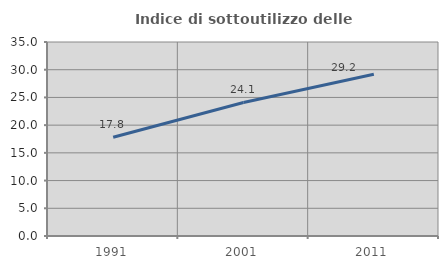
| Category | Indice di sottoutilizzo delle abitazioni  |
|---|---|
| 1991.0 | 17.807 |
| 2001.0 | 24.097 |
| 2011.0 | 29.196 |